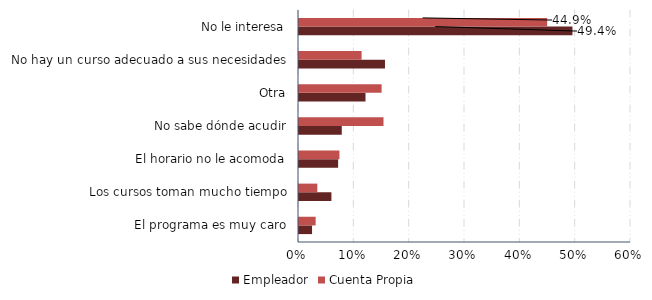
| Category | Empleador | Cuenta Propia |
|---|---|---|
| El programa es muy caro | 0.024 | 0.03 |
| Los cursos toman mucho tiempo | 0.059 | 0.033 |
| El horario no le acomoda | 0.071 | 0.073 |
| No sabe dónde acudir | 0.077 | 0.153 |
| Otra | 0.12 | 0.149 |
| No hay un curso adecuado a sus necesidades | 0.155 | 0.113 |
| No le interesa | 0.494 | 0.448 |